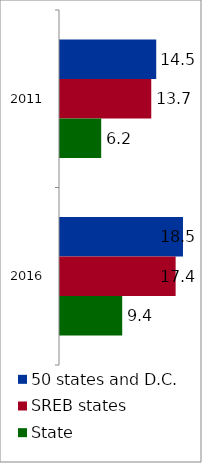
| Category | 50 states and D.C. | SREB states | State |
|---|---|---|---|
| 2011.0 | 14.47 | 13.723 | 6.194 |
| 2016.0 | 18.493 | 17.388 | 9.356 |